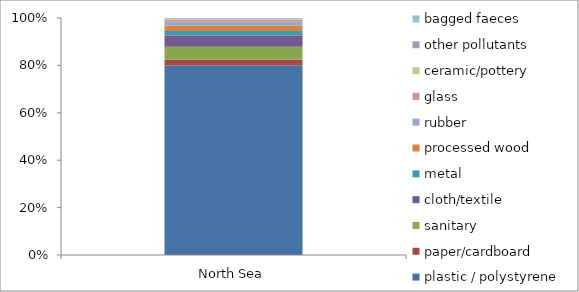
| Category | plastic / polystyrene | paper/cardboard | sanitary | cloth/textile | metal | processed wood | rubber | glass | ceramic/pottery | other pollutants | bagged faeces |
|---|---|---|---|---|---|---|---|---|---|---|---|
| North Sea | 70533 | 2153 | 4902 | 4167 | 1674 | 1916 | 1517 | 843 | 186 | 300 | 56 |